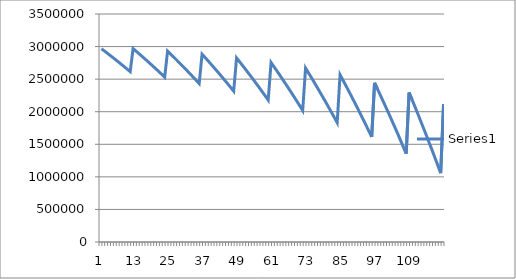
| Category | Series 0 |
|---|---|
| 0 | 2966863 |
| 1 | 2933365.635 |
| 2 | 2899503.986 |
| 3 | 2865274.092 |
| 4 | 2830671.948 |
| 5 | 2795693.505 |
| 6 | 2760334.672 |
| 7 | 2724591.312 |
| 8 | 2688459.242 |
| 9 | 2651934.237 |
| 10 | 2615012.021 |
| 11 | 2969188.277 |
| 12 | 2931458.637 |
| 13 | 2893318.687 |
| 14 | 2854763.966 |
| 15 | 2815789.961 |
| 16 | 2776392.115 |
| 17 | 2736565.816 |
| 18 | 2696306.407 |
| 19 | 2655609.177 |
| 20 | 2614469.364 |
| 21 | 2572882.156 |
| 22 | 2530842.687 |
| 23 | 2930936.789 |
| 24 | 2887977.989 |
| 25 | 2844552.013 |
| 26 | 2800653.779 |
| 27 | 2756278.152 |
| 28 | 2711419.94 |
| 29 | 2666073.895 |
| 30 | 2620234.712 |
| 31 | 2573897.027 |
| 32 | 2527055.421 |
| 33 | 2479704.411 |
| 34 | 2431838.46 |
| 35 | 2883800.809 |
| 36 | 2834888.112 |
| 37 | 2785443.49 |
| 38 | 2735461.157 |
| 39 | 2684935.267 |
| 40 | 2633859.907 |
| 41 | 2582229.103 |
| 42 | 2530036.814 |
| 43 | 2477276.934 |
| 44 | 2423943.29 |
| 45 | 2370029.643 |
| 46 | 2315529.685 |
| 47 | 2826081.406 |
| 48 | 2770389.629 |
| 49 | 2714092.203 |
| 50 | 2657182.542 |
| 51 | 2599653.989 |
| 52 | 2541499.813 |
| 53 | 2482713.211 |
| 54 | 2423287.304 |
| 55 | 2363215.14 |
| 56 | 2302489.692 |
| 57 | 2241103.854 |
| 58 | 2179050.446 |
| 59 | 2755783.163 |
| 60 | 2692372.754 |
| 61 | 2628272.757 |
| 62 | 2563475.672 |
| 63 | 2497973.919 |
| 64 | 2431759.834 |
| 65 | 2364825.671 |
| 66 | 2297163.6 |
| 67 | 2228765.703 |
| 68 | 2159623.979 |
| 69 | 2089730.339 |
| 70 | 2019076.605 |
| 71 | 2670565.124 |
| 72 | 2598366.316 |
| 73 | 2525382.346 |
| 74 | 2451604.675 |
| 75 | 2377024.672 |
| 76 | 2301633.611 |
| 77 | 2225422.673 |
| 78 | 2148382.94 |
| 79 | 2070505.401 |
| 80 | 1991780.943 |
| 81 | 1912200.357 |
| 82 | 1831754.332 |
| 83 | 2567683.903 |
| 84 | 2485478.663 |
| 85 | 2402379.441 |
| 86 | 2318376.515 |
| 87 | 2233460.057 |
| 88 | 2147620.133 |
| 89 | 2060846.699 |
| 90 | 1973129.605 |
| 91 | 1884458.587 |
| 92 | 1794823.271 |
| 93 | 1704213.172 |
| 94 | 1612617.688 |
| 95 | 2443927.732 |
| 96 | 2350329.214 |
| 97 | 2255712.811 |
| 98 | 2160067.455 |
| 99 | 2063381.956 |
| 100 | 1965645.002 |
| 101 | 1866845.159 |
| 102 | 1766970.867 |
| 103 | 1666010.443 |
| 104 | 1563952.074 |
| 105 | 1460783.82 |
| 106 | 1356493.611 |
| 107 | 2295540.039 |
| 108 | 2188969.184 |
| 109 | 2081239.372 |
| 110 | 1972337.997 |
| 111 | 1862252.32 |
| 112 | 1750969.462 |
| 113 | 1638476.402 |
| 114 | 1524759.98 |
| 115 | 1409806.893 |
| 116 | 1293603.69 |
| 117 | 1176136.778 |
| 118 | 1057392.412 |
| 119 | 2118130.933 |